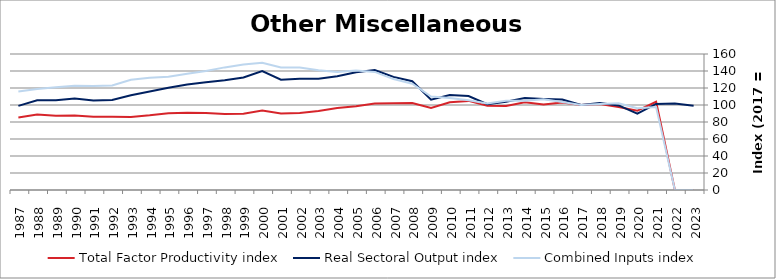
| Category | Total Factor Productivity index | Real Sectoral Output index | Combined Inputs index |
|---|---|---|---|
| 2023.0 | 0 | 99.153 | 0 |
| 2022.0 | 0 | 101.727 | 0 |
| 2021.0 | 103.747 | 101.196 | 97.54 |
| 2020.0 | 93.375 | 89.871 | 96.247 |
| 2019.0 | 97.658 | 99.534 | 101.921 |
| 2018.0 | 101.217 | 102.404 | 101.172 |
| 2017.0 | 100 | 100 | 100 |
| 2016.0 | 102.79 | 106.375 | 103.488 |
| 2015.0 | 100.455 | 107.137 | 106.651 |
| 2014.0 | 103.084 | 108.099 | 104.865 |
| 2013.0 | 98.916 | 103.854 | 104.992 |
| 2012.0 | 99.125 | 100.991 | 101.882 |
| 2011.0 | 104.831 | 110.623 | 105.525 |
| 2010.0 | 103.159 | 111.692 | 108.272 |
| 2009.0 | 96.609 | 106.246 | 109.975 |
| 2008.0 | 102.34 | 127.926 | 125.001 |
| 2007.0 | 101.977 | 133.096 | 130.516 |
| 2006.0 | 101.694 | 141.247 | 138.894 |
| 2005.0 | 98.59 | 138.472 | 140.452 |
| 2004.0 | 96.49 | 133.951 | 138.823 |
| 2003.0 | 92.907 | 131.004 | 141.005 |
| 2002.0 | 90.725 | 130.783 | 144.153 |
| 2001.0 | 89.908 | 129.683 | 144.24 |
| 2000.0 | 93.411 | 139.932 | 149.802 |
| 1999.0 | 89.782 | 132.453 | 147.527 |
| 1998.0 | 89.514 | 129.125 | 144.251 |
| 1997.0 | 90.558 | 126.718 | 139.93 |
| 1996.0 | 90.906 | 124.229 | 136.657 |
| 1995.0 | 90.263 | 120.247 | 133.218 |
| 1994.0 | 87.844 | 115.986 | 132.036 |
| 1993.0 | 85.957 | 111.448 | 129.655 |
| 1992.0 | 86.145 | 105.93 | 122.967 |
| 1991.0 | 86.038 | 105.361 | 122.458 |
| 1990.0 | 87.776 | 107.62 | 122.608 |
| 1989.0 | 87.342 | 105.531 | 120.825 |
| 1988.0 | 88.777 | 105.597 | 118.947 |
| 1987.0 | 85.425 | 98.948 | 115.83 |